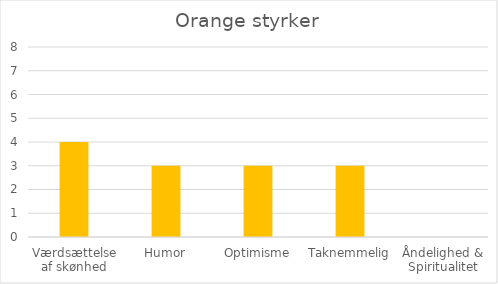
| Category | Series 0 |
|---|---|
| Værdsættelse af skønhed | 4 |
| Humor | 3 |
| Optimisme | 3 |
| Taknemmelig | 3 |
| Åndelighed & Spiritualitet | 0 |